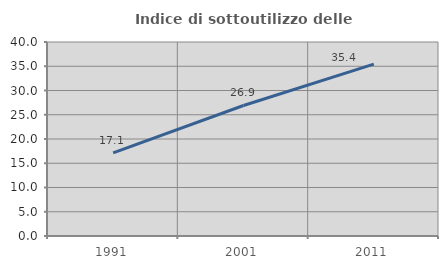
| Category | Indice di sottoutilizzo delle abitazioni  |
|---|---|
| 1991.0 | 17.121 |
| 2001.0 | 26.91 |
| 2011.0 | 35.432 |